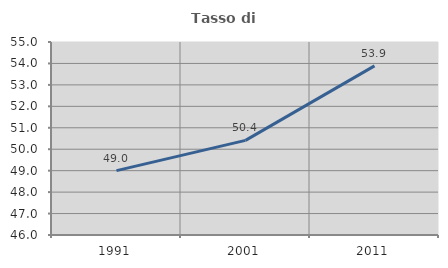
| Category | Tasso di occupazione   |
|---|---|
| 1991.0 | 49.001 |
| 2001.0 | 50.413 |
| 2011.0 | 53.885 |